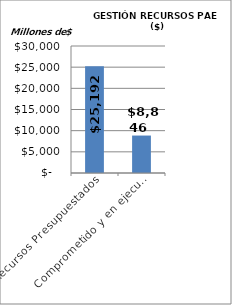
| Category | Series 0 |
|---|---|
| Recursos Presupuestados | 25192.187 |
| Comprometido y en ejecución  | 8846 |